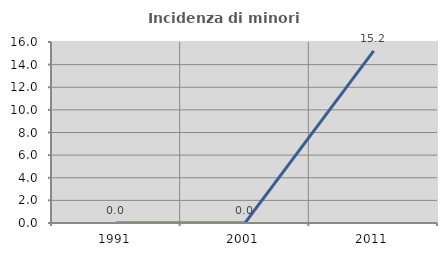
| Category | Incidenza di minori stranieri |
|---|---|
| 1991.0 | 0 |
| 2001.0 | 0 |
| 2011.0 | 15.217 |